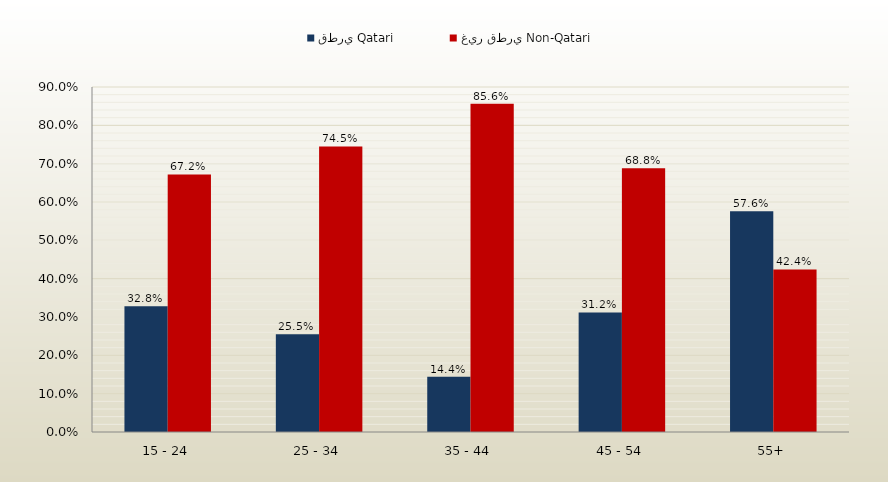
| Category | قطري Qatari | غير قطري Non-Qatari |
|---|---|---|
| 15 - 24 | 0.328 | 0.672 |
| 25 - 34 | 0.255 | 0.745 |
| 35 - 44 | 0.144 | 0.856 |
| 45 - 54 | 0.312 | 0.688 |
| 55+ | 0.576 | 0.424 |